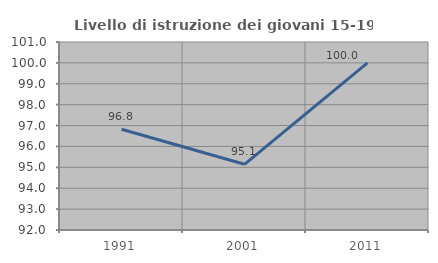
| Category | Livello di istruzione dei giovani 15-19 anni |
|---|---|
| 1991.0 | 96.825 |
| 2001.0 | 95.146 |
| 2011.0 | 100 |